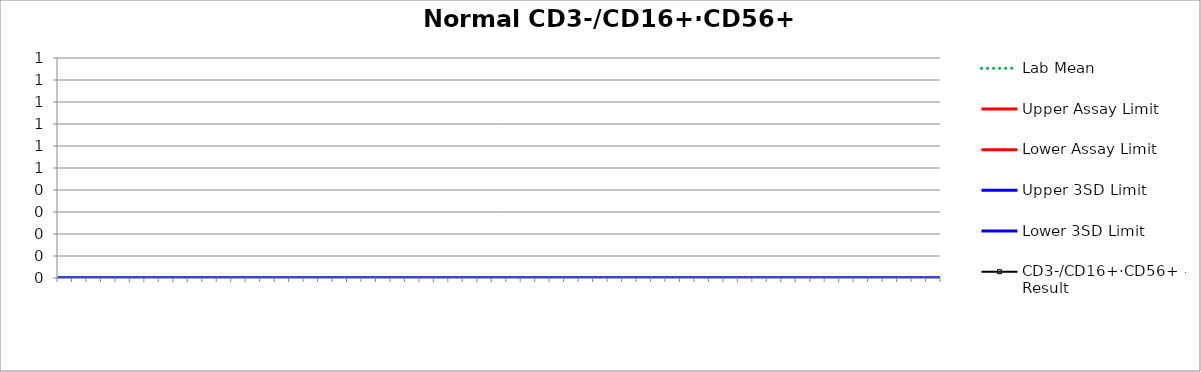
| Category | Lab Mean | Upper Assay Limit | Lower Assay Limit | Upper 3SD Limit | Lower 3SD Limit | CD3-/CD16+·CD56+ # Result |
|---|---|---|---|---|---|---|
|  | 0 |  |  | 0 | 0 |  |
|  | 0 |  |  | 0 | 0 |  |
|  | 0 |  |  | 0 | 0 |  |
|  | 0 |  |  | 0 | 0 |  |
|  | 0 |  |  | 0 | 0 |  |
|  | 0 |  |  | 0 | 0 |  |
|  | 0 |  |  | 0 | 0 |  |
|  | 0 |  |  | 0 | 0 |  |
|  | 0 |  |  | 0 | 0 |  |
|  | 0 |  |  | 0 | 0 |  |
|  | 0 |  |  | 0 | 0 |  |
|  | 0 |  |  | 0 | 0 |  |
|  | 0 |  |  | 0 | 0 |  |
|  | 0 |  |  | 0 | 0 |  |
|  | 0 |  |  | 0 | 0 |  |
|  | 0 |  |  | 0 | 0 |  |
|  | 0 |  |  | 0 | 0 |  |
|  | 0 |  |  | 0 | 0 |  |
|  | 0 |  |  | 0 | 0 |  |
|  | 0 |  |  | 0 | 0 |  |
|  | 0 |  |  | 0 | 0 |  |
|  | 0 |  |  | 0 | 0 |  |
|  | 0 |  |  | 0 | 0 |  |
|  | 0 |  |  | 0 | 0 |  |
|  | 0 |  |  | 0 | 0 |  |
|  | 0 |  |  | 0 | 0 |  |
|  | 0 |  |  | 0 | 0 |  |
|  | 0 |  |  | 0 | 0 |  |
|  | 0 |  |  | 0 | 0 |  |
|  | 0 |  |  | 0 | 0 |  |
|  | 0 |  |  | 0 | 0 |  |
|  | 0 |  |  | 0 | 0 |  |
|  | 0 |  |  | 0 | 0 |  |
|  | 0 |  |  | 0 | 0 |  |
|  | 0 |  |  | 0 | 0 |  |
|  | 0 |  |  | 0 | 0 |  |
|  | 0 |  |  | 0 | 0 |  |
|  | 0 |  |  | 0 | 0 |  |
|  | 0 |  |  | 0 | 0 |  |
|  | 0 |  |  | 0 | 0 |  |
|  | 0 |  |  | 0 | 0 |  |
|  | 0 |  |  | 0 | 0 |  |
|  | 0 |  |  | 0 | 0 |  |
|  | 0 |  |  | 0 | 0 |  |
|  | 0 |  |  | 0 | 0 |  |
|  | 0 |  |  | 0 | 0 |  |
|  | 0 |  |  | 0 | 0 |  |
|  | 0 |  |  | 0 | 0 |  |
|  | 0 |  |  | 0 | 0 |  |
|  | 0 |  |  | 0 | 0 |  |
|  | 0 |  |  | 0 | 0 |  |
|  | 0 |  |  | 0 | 0 |  |
|  | 0 |  |  | 0 | 0 |  |
|  | 0 |  |  | 0 | 0 |  |
|  | 0 |  |  | 0 | 0 |  |
|  | 0 |  |  | 0 | 0 |  |
|  | 0 |  |  | 0 | 0 |  |
|  | 0 |  |  | 0 | 0 |  |
|  | 0 |  |  | 0 | 0 |  |
|  | 0 |  |  | 0 | 0 |  |
|  | 0 |  |  | 0 | 0 |  |
|  | 0 |  |  | 0 | 0 |  |